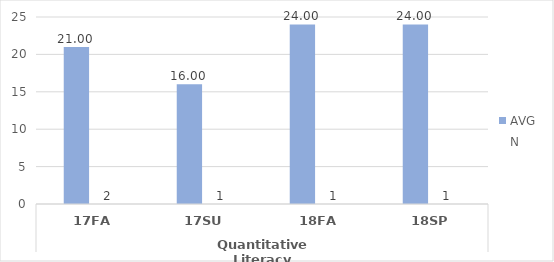
| Category | ENGL.AA - AVG | ENGL.AA - N |
|---|---|---|
| 0 | 21 | 2 |
| 1 | 16 | 1 |
| 2 | 24 | 1 |
| 3 | 24 | 1 |